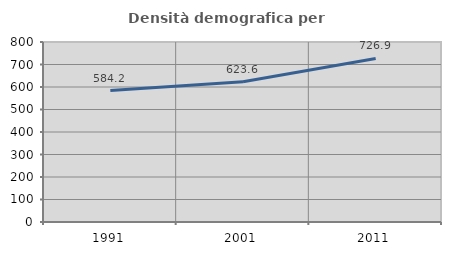
| Category | Densità demografica |
|---|---|
| 1991.0 | 584.202 |
| 2001.0 | 623.572 |
| 2011.0 | 726.892 |